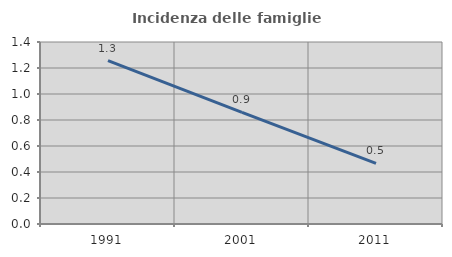
| Category | Incidenza delle famiglie numerose |
|---|---|
| 1991.0 | 1.257 |
| 2001.0 | 0.858 |
| 2011.0 | 0.466 |